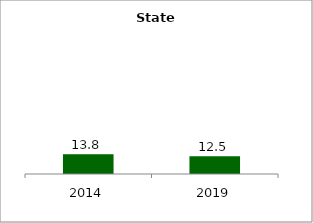
| Category | State |
|---|---|
| 2014.0 | 13.846 |
| 2019.0 | 12.492 |